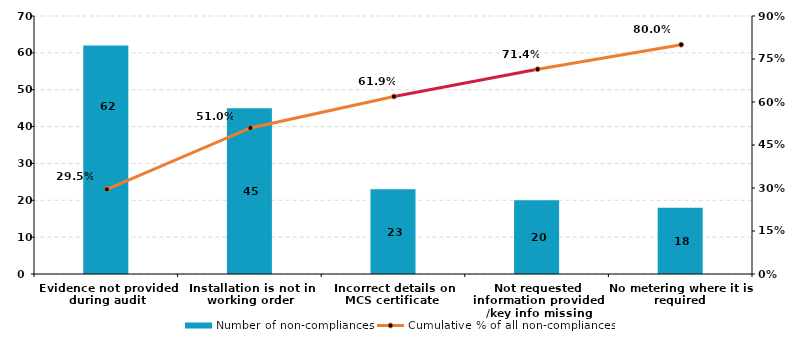
| Category | Number of non-compliances |
|---|---|
| Evidence not provided during audit | 62 |
| Installation is not in working order | 45 |
| Incorrect details on MCS certificate  | 23 |
| Not requested information provided /key info missing | 20 |
| No metering where it is required | 18 |